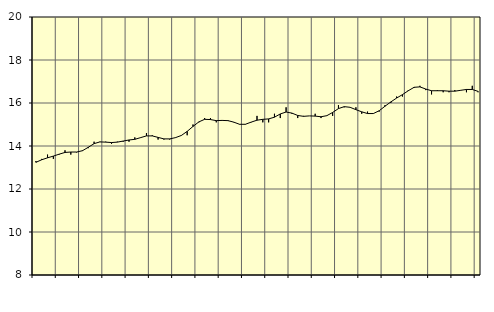
| Category | Piggar | Vård och omsorg, SNI 86-88 |
|---|---|---|
| nan | 13.3 | 13.24 |
| 1.0 | 13.4 | 13.36 |
| 1.0 | 13.6 | 13.45 |
| 1.0 | 13.4 | 13.53 |
| nan | 13.6 | 13.62 |
| 2.0 | 13.8 | 13.7 |
| 2.0 | 13.6 | 13.72 |
| 2.0 | 13.7 | 13.72 |
| nan | 13.8 | 13.78 |
| 3.0 | 13.9 | 13.94 |
| 3.0 | 14.2 | 14.11 |
| 3.0 | 14.2 | 14.19 |
| nan | 14.2 | 14.18 |
| 4.0 | 14.1 | 14.16 |
| 4.0 | 14.2 | 14.18 |
| 4.0 | 14.2 | 14.23 |
| nan | 14.2 | 14.28 |
| 5.0 | 14.4 | 14.31 |
| 5.0 | 14.4 | 14.39 |
| 5.0 | 14.6 | 14.47 |
| nan | 14.5 | 14.47 |
| 6.0 | 14.3 | 14.4 |
| 6.0 | 14.3 | 14.33 |
| 6.0 | 14.3 | 14.33 |
| nan | 14.4 | 14.39 |
| 7.0 | 14.5 | 14.49 |
| 7.0 | 14.5 | 14.68 |
| 7.0 | 15 | 14.91 |
| nan | 15.1 | 15.12 |
| 8.0 | 15.3 | 15.24 |
| 8.0 | 15.3 | 15.23 |
| 8.0 | 15.1 | 15.18 |
| nan | 15.2 | 15.19 |
| 9.0 | 15.2 | 15.18 |
| 9.0 | 15.1 | 15.11 |
| 9.0 | 15 | 15.01 |
| nan | 15 | 15.01 |
| 10.0 | 15.1 | 15.11 |
| 10.0 | 15.4 | 15.2 |
| 10.0 | 15.1 | 15.24 |
| nan | 15.1 | 15.26 |
| 11.0 | 15.5 | 15.34 |
| 11.0 | 15.3 | 15.49 |
| 11.0 | 15.8 | 15.58 |
| nan | 15.5 | 15.53 |
| 12.0 | 15.3 | 15.42 |
| 12.0 | 15.4 | 15.38 |
| 12.0 | 15.4 | 15.4 |
| nan | 15.5 | 15.39 |
| 13.0 | 15.3 | 15.36 |
| 13.0 | 15.4 | 15.41 |
| 13.0 | 15.4 | 15.56 |
| nan | 15.9 | 15.74 |
| 14.0 | 15.8 | 15.83 |
| 14.0 | 15.8 | 15.8 |
| 14.0 | 15.8 | 15.69 |
| nan | 15.5 | 15.59 |
| 15.0 | 15.6 | 15.51 |
| 15.0 | 15.5 | 15.51 |
| 15.0 | 15.6 | 15.64 |
| nan | 15.9 | 15.85 |
| 16.0 | 16 | 16.05 |
| 16.0 | 16.3 | 16.23 |
| 16.0 | 16.3 | 16.39 |
| nan | 16.6 | 16.57 |
| 17.0 | 16.7 | 16.73 |
| 17.0 | 16.8 | 16.75 |
| 17.0 | 16.6 | 16.65 |
| nan | 16.4 | 16.57 |
| 18.0 | 16.6 | 16.57 |
| 18.0 | 16.5 | 16.57 |
| 18.0 | 16.5 | 16.55 |
| nan | 16.6 | 16.55 |
| 19.0 | 16.6 | 16.59 |
| 19.0 | 16.5 | 16.63 |
| 19.0 | 16.8 | 16.63 |
| nan | 16.5 | 16.54 |